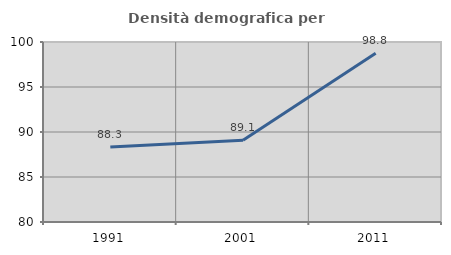
| Category | Densità demografica |
|---|---|
| 1991.0 | 88.329 |
| 2001.0 | 89.088 |
| 2011.0 | 98.76 |